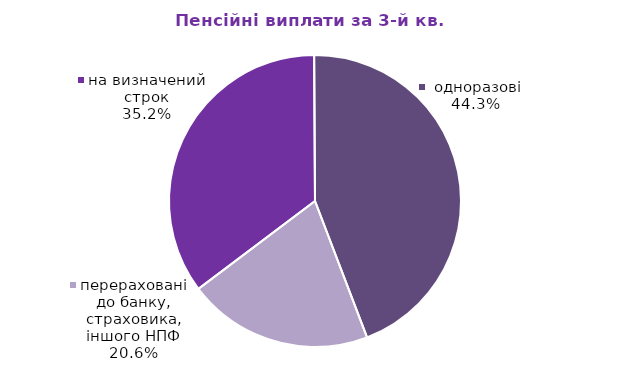
| Category | Series 0 |
|---|---|
| на визначений строк | 10.763 |
|  одноразові | 13.548 |
| перераховані до банку, страховика, іншого НПФ | 6.279 |